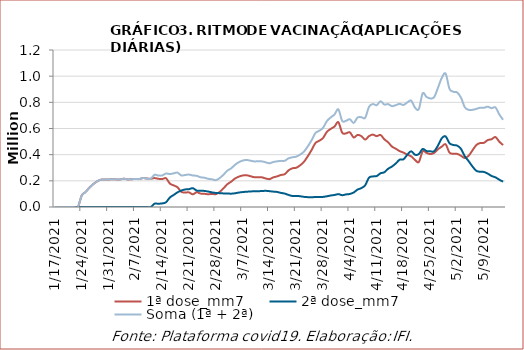
| Category | 1ª dose_mm7 | 2ª dose_mm7 | Soma (1ª + 2ª) |
|---|---|---|---|
| 1/17/21 | 0 | 0 | 0 |
| 1/18/21 | 0 | 0 | 0 |
| 1/19/21 | 0 | 0 | 0 |
| 1/20/21 | 0 | 0 | 0 |
| 1/21/21 | 0 | 0 | 0 |
| 1/22/21 | 0 | 0 | 0 |
| 1/23/21 | 0 | 0 | 0 |
| 1/24/21 | 87691.714 | 0 | 87691.714 |
| 1/25/21 | 114378.571 | 0 | 114378.571 |
| 1/26/21 | 147459.857 | 0 | 147459.857 |
| 1/27/21 | 174531.714 | 0 | 174531.714 |
| 1/28/21 | 195628.429 | 0 | 195628.429 |
| 1/29/21 | 208792 | 0 | 208792 |
| 1/30/21 | 210465 | 0 | 210465 |
| 1/31/21 | 210023.571 | 0 | 210023.571 |
| 2/1/21 | 212970.286 | 0 | 212970.286 |
| 2/2/21 | 210851.143 | 0 | 210851.143 |
| 2/3/21 | 210655.429 | 0 | 210655.429 |
| 2/4/21 | 215972.571 | 0 | 215972.571 |
| 2/5/21 | 210801.143 | 0 | 210801.143 |
| 2/6/21 | 212497.286 | 0 | 212497.286 |
| 2/7/21 | 213675.857 | 0 | 213675.857 |
| 2/8/21 | 213434.286 | 0 | 213434.286 |
| 2/9/21 | 221139 | 0 | 221139 |
| 2/10/21 | 217705.857 | 0 | 217705.857 |
| 2/11/21 | 215909.143 | 0 | 215909.143 |
| 2/12/21 | 221045.286 | 25215.143 | 246260.429 |
| 2/13/21 | 215529.857 | 24936.143 | 240466 |
| 2/14/21 | 213751.429 | 27454.429 | 241205.857 |
| 2/15/21 | 219675.143 | 36000.571 | 255675.714 |
| 2/16/21 | 179475.714 | 72411 | 251886.714 |
| 2/17/21 | 165264.286 | 91856.429 | 257120.714 |
| 2/18/21 | 150601.857 | 112115.286 | 262717.143 |
| 2/19/21 | 115660.429 | 125477 | 241137.429 |
| 2/20/21 | 110742.143 | 134094.857 | 244837 |
| 2/21/21 | 111567.143 | 136201 | 247768.143 |
| 2/22/21 | 96936.571 | 144081.143 | 241017.714 |
| 2/23/21 | 112867.857 | 125437.429 | 238305.286 |
| 2/24/21 | 102732.857 | 124741.429 | 227474.286 |
| 2/25/21 | 100898 | 122906.429 | 223804.429 |
| 2/26/21 | 97353.571 | 118199.857 | 215553.429 |
| 2/27/21 | 100102.857 | 111720.857 | 211823.714 |
| 2/28/21 | 97875.143 | 107417.286 | 205292.429 |
| 3/1/21 | 114774.286 | 105792.286 | 220566.571 |
| 3/2/21 | 142591 | 103929.857 | 246520.857 |
| 3/3/21 | 173685.286 | 103554.143 | 277239.429 |
| 3/4/21 | 193482.429 | 101856.571 | 295339 |
| 3/5/21 | 217300.429 | 104771 | 322071.429 |
| 3/6/21 | 231910.857 | 110534.857 | 342445.714 |
| 3/7/21 | 240780.714 | 113934.429 | 354715.143 |
| 3/8/21 | 242667.571 | 116827.714 | 359495.286 |
| 3/9/21 | 235761.143 | 118354.429 | 354115.571 |
| 3/10/21 | 227920.143 | 120855.143 | 348775.286 |
| 3/11/21 | 228195 | 120950.571 | 349145.571 |
| 3/12/21 | 226959.429 | 121780.286 | 348739.714 |
| 3/13/21 | 218280.429 | 123582.571 | 341863 |
| 3/14/21 | 212934 | 121102.429 | 334036.429 |
| 3/15/21 | 226117.286 | 117608.286 | 343725.571 |
| 3/16/21 | 233977.286 | 114974.571 | 348951.857 |
| 3/17/21 | 244597.286 | 107915.286 | 352512.571 |
| 3/18/21 | 251033.714 | 102455.286 | 353489 |
| 3/19/21 | 280263.714 | 91969 | 372232.714 |
| 3/20/21 | 295695 | 84299.143 | 379994.143 |
| 3/21/21 | 300039 | 84775.143 | 384814.143 |
| 3/22/21 | 318151.429 | 82352.714 | 400504.143 |
| 3/23/21 | 345060.571 | 77630.429 | 422691 |
| 3/24/21 | 387271.286 | 75313 | 462584.286 |
| 3/25/21 | 435312.429 | 74365.143 | 509677.571 |
| 3/26/21 | 488485.714 | 76439.571 | 564925.286 |
| 3/27/21 | 506042.286 | 76584 | 582626.286 |
| 3/28/21 | 527927.429 | 77297.571 | 605225 |
| 3/29/21 | 574347.429 | 81889.857 | 656237.286 |
| 3/30/21 | 596767.429 | 87891.714 | 684659.143 |
| 3/31/21 | 615622.714 | 91878.143 | 707500.857 |
| 4/1/21 | 648013.429 | 98480.857 | 746494.286 |
| 4/2/21 | 567419.429 | 90206.571 | 657626 |
| 4/3/21 | 562887.714 | 96169.143 | 659056.857 |
| 4/4/21 | 570908.429 | 99624.429 | 670532.857 |
| 4/5/21 | 531573.857 | 110964.571 | 642538.429 |
| 4/6/21 | 550705.143 | 132974.571 | 683679.714 |
| 4/7/21 | 541821.714 | 144577.143 | 686398.857 |
| 4/8/21 | 515369.143 | 166494.143 | 681863.286 |
| 4/9/21 | 541781.143 | 224414.571 | 766195.714 |
| 4/10/21 | 553547.143 | 233480.571 | 787027.714 |
| 4/11/21 | 541509 | 236523.571 | 778032.571 |
| 4/12/21 | 550602.714 | 257667 | 808269.714 |
| 4/13/21 | 517574 | 265454.857 | 783028.857 |
| 4/14/21 | 493985.143 | 292344.714 | 786329.857 |
| 4/15/21 | 461654.571 | 309270.714 | 770925.286 |
| 4/16/21 | 445285.571 | 333124.429 | 778410 |
| 4/17/21 | 426854.714 | 361605 | 788459.714 |
| 4/18/21 | 415626.571 | 364408.857 | 780035.429 |
| 4/19/21 | 399530.286 | 399621 | 799151.286 |
| 4/20/21 | 387276.429 | 425937.857 | 813214.286 |
| 4/21/21 | 360239 | 399670.429 | 759909.429 |
| 4/22/21 | 344117.143 | 404559.857 | 748677 |
| 4/23/21 | 424800.143 | 443722.143 | 868522.286 |
| 4/24/21 | 413692.429 | 427887.143 | 841579.571 |
| 4/25/21 | 404459.286 | 425484.857 | 829944.143 |
| 4/26/21 | 413531.429 | 426000 | 839531.429 |
| 4/27/21 | 441692.857 | 469422.143 | 911115 |
| 4/28/21 | 461517.286 | 525918.429 | 987435.714 |
| 4/29/21 | 479525.714 | 539777.714 | 1019303.429 |
| 4/30/21 | 416126.714 | 487594.143 | 903720.857 |
| 5/1/21 | 407125.429 | 474101.286 | 881226.714 |
| 5/2/21 | 406129.571 | 469421.857 | 875551.429 |
| 5/3/21 | 391909 | 444680.286 | 836589.286 |
| 5/4/21 | 374321.143 | 388339.857 | 762661 |
| 5/5/21 | 391674.429 | 350671.286 | 742345.714 |
| 5/6/21 | 432499.714 | 310128.714 | 742628.429 |
| 5/7/21 | 473108.286 | 276701 | 749809.286 |
| 5/8/21 | 488929.857 | 269489.286 | 758419.143 |
| 5/9/21 | 490522 | 267836.714 | 758358.714 |
| 5/10/21 | 511558.429 | 254947 | 766505.429 |
| 5/11/21 | 518190.857 | 237066.571 | 755257.429 |
| 5/12/21 | 534798.286 | 226764.714 | 761563 |
| 5/13/21 | 499614.143 | 208868 | 708482.143 |
| 5/14/21 | 473136.714 | 193410 | 666546.714 |